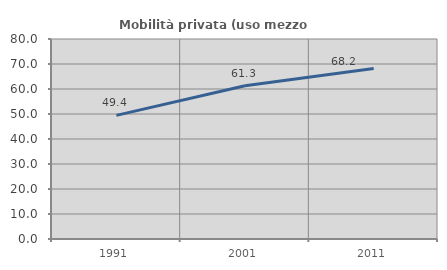
| Category | Mobilità privata (uso mezzo privato) |
|---|---|
| 1991.0 | 49.442 |
| 2001.0 | 61.301 |
| 2011.0 | 68.182 |